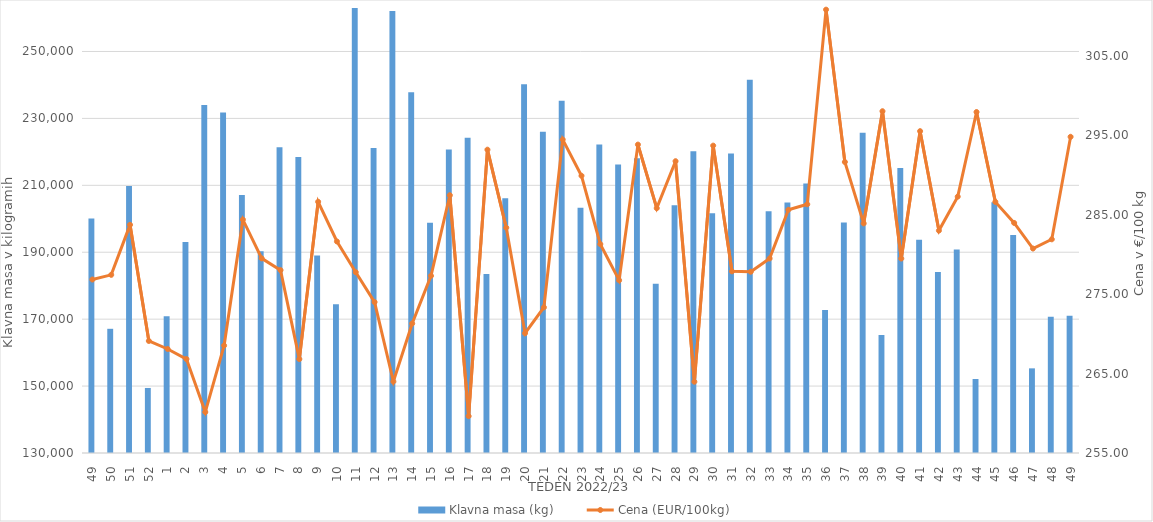
| Category | Klavna masa (kg) |
|---|---|
| 49.0 | 200117 |
| 50.0 | 167119 |
| 51.0 | 209797 |
| 52.0 | 149439 |
| 1.0 | 170843 |
| 2.0 | 193093 |
| 3.0 | 234042 |
| 4.0 | 231737 |
| 5.0 | 207136 |
| 6.0 | 190311 |
| 7.0 | 221366 |
| 8.0 | 218470 |
| 9.0 | 189006 |
| 10.0 | 174425 |
| 11.0 | 265476 |
| 12.0 | 221171 |
| 13.0 | 262102 |
| 14.0 | 237813 |
| 15.0 | 198828 |
| 16.0 | 220686 |
| 17.0 | 224192 |
| 18.0 | 183508 |
| 19.0 | 206133 |
| 20.0 | 240223 |
| 21.0 | 226050 |
| 22.0 | 235273 |
| 23.0 | 203306 |
| 24.0 | 222178 |
| 25.0 | 216259 |
| 26.0 | 218064 |
| 27.0 | 180556 |
| 28.0 | 204078 |
| 29.0 | 220162 |
| 30.0 | 201649 |
| 31.0 | 219538 |
| 32.0 | 241549 |
| 33.0 | 202261 |
| 34.0 | 204903 |
| 35.0 | 210575 |
| 36.0 | 172745 |
| 37.0 | 198877 |
| 38.0 | 225730 |
| 39.0 | 165273 |
| 40.0 | 215175 |
| 41.0 | 193769 |
| 42.0 | 184122 |
| 43.0 | 190834 |
| 44.0 | 152119 |
| 45.0 | 204974 |
| 46.0 | 195179 |
| 47.0 | 155300 |
| 48.0 | 170687 |
| 49.0 | 171040 |